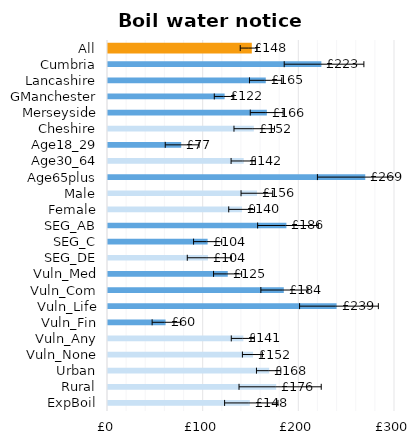
| Category | Series 0 |
|---|---|
| All | 147.706 |
| Cumbria | 223.032 |
| Lancashire | 164.919 |
| GManchester | 121.91 |
| Merseyside | 166.049 |
| Cheshire | 152.436 |
| Age18_29 | 76.522 |
| Age30_64 | 141.817 |
| Age65plus | 268.913 |
| Male | 155.768 |
| Female | 140.083 |
| SEG_AB | 186.493 |
| SEG_C | 104.137 |
| SEG_DE | 104.467 |
| Vuln_Med | 125.181 |
| Vuln_Com | 183.761 |
| Vuln_Life | 238.96 |
| Vuln_Fin | 60.184 |
| Vuln_Any | 141.471 |
| Vuln_None | 151.627 |
| Urban | 168.472 |
| Rural | 175.793 |
| ExpBoil | 148.22 |